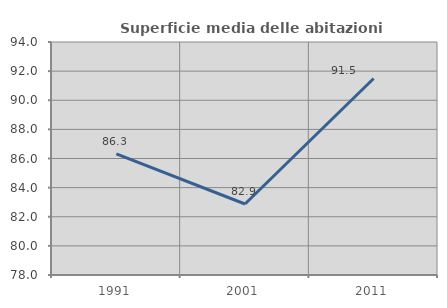
| Category | Superficie media delle abitazioni occupate |
|---|---|
| 1991.0 | 86.311 |
| 2001.0 | 82.876 |
| 2011.0 | 91.493 |